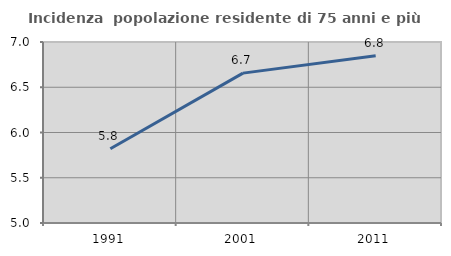
| Category | Incidenza  popolazione residente di 75 anni e più |
|---|---|
| 1991.0 | 5.82 |
| 2001.0 | 6.656 |
| 2011.0 | 6.848 |